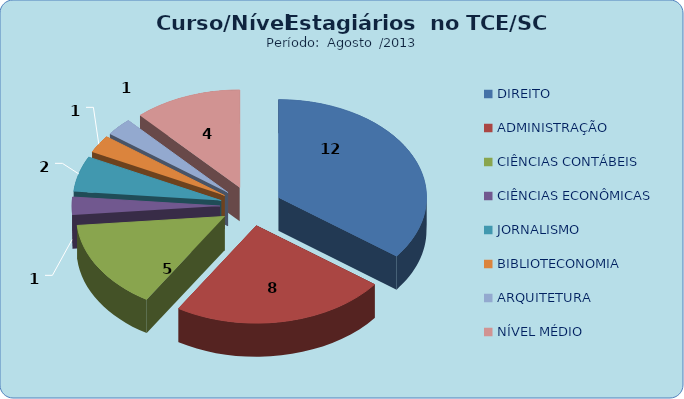
| Category | Series 0 |
|---|---|
| DIREITO | 12 |
| ADMINISTRAÇÃO | 8 |
| CIÊNCIAS CONTÁBEIS | 5 |
| CIÊNCIAS ECONÔMICAS | 1 |
| JORNALISMO | 2 |
| BIBLIOTECONOMIA | 1 |
| ARQUITETURA | 1 |
| NÍVEL MÉDIO | 4 |